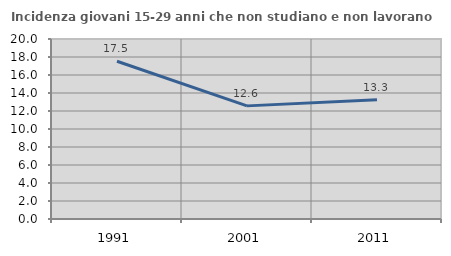
| Category | Incidenza giovani 15-29 anni che non studiano e non lavorano  |
|---|---|
| 1991.0 | 17.526 |
| 2001.0 | 12.57 |
| 2011.0 | 13.252 |